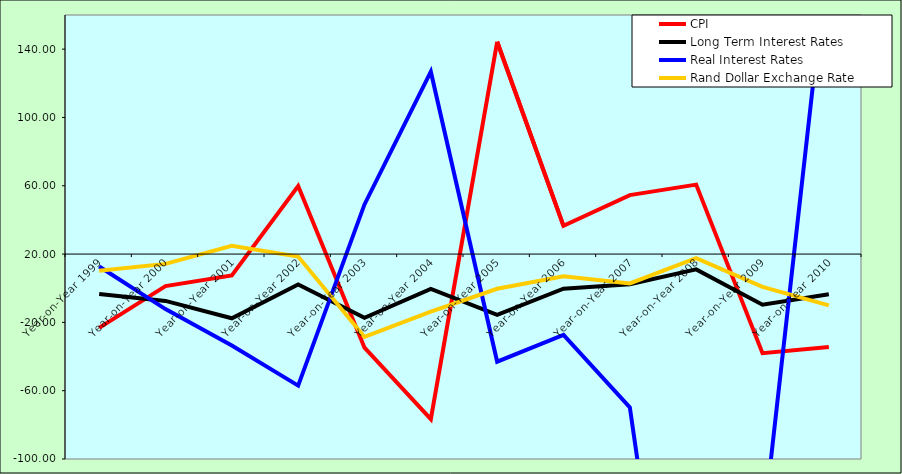
| Category | CPI | Long Term Interest Rates | Real Interest Rates | Rand Dollar Exchange Rate |
|---|---|---|---|---|
| Year-on-Year 1999 | -23.236 | -3.346 | 12.704 | 10.213 |
| Year-on-Year 2000 | 1.268 | -7.442 | -12.229 | 14.266 |
| Year-on-Year 2001 | 7.512 | -17.605 | -33.533 | 24.891 |
| Year-on-Year 2002 | 59.825 | 2.141 | -57.029 | 18.584 |
| Year-on-Year 2003 | -34.791 | -17.373 | 49.079 | -28.542 |
| Year-on-Year 2004 | -76.676 | -0.441 | 126.78 | -13.717 |
| Year-on-Year 2005 | 144.311 | -15.553 | -42.991 | -0.325 |
| Year-on-Year 2006 | 36.52 | -0.27 | -27.33 | 6.978 |
| Year-on-Year 2007 | 54.529 | 2.364 | -69.717 | 2.831 |
| Year-on-Year 2008 | 60.678 | 11.02 | -339.12 | 17.637 |
| Year-on-Year 2009 | -38.033 | -9.642 | -144.159 | 0.828 |
| Year-on-Year 2010 | -34.422 | -3.53 | 201.862 | -10.075 |